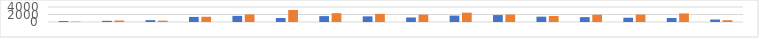
| Category | Series 0 | Series 1 |
|---|---|---|
| 7:00-8:00 | 256 | 108 |
| 8:00-9:00 | 312 | 396 |
| 9:00-10:00 | 492 | 356 |
| 10:00-11:00 | 1356 | 1396 |
| 11:00-12:00 | 1632 | 2016 |
| 12:00-13:00 | 1072 | 3204 |
| 13:00-14:00 | 1576 | 2356 |
| 14:00-15:00 | 1504 | 2160 |
| 15:00-16:00 | 1204 | 1964 |
| 16:00-17:00 | 1700 | 2492 |
| 17:00-18:00 | 1848 | 1988 |
| 18:00-19:00 | 1424 | 1612 |
| 19:00-20:00 | 1300 | 1936 |
| 20:00-21:00 | 1136 | 1988 |
| 21:00-22:00 | 1072 | 2288 |
| 22:00-23:00 | 668 | 484 |